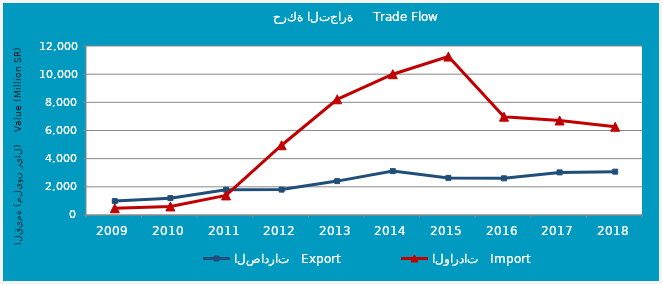
| Category | الصادرات   Export | الواردات   Import |
|---|---|---|
| 2009.0 | 987022297 | 477015029 |
| 2010.0 | 1197208048 | 607322872 |
| 2011.0 | 1796453789 | 1391921185 |
| 2012.0 | 1803195987 | 4952975328 |
| 2013.0 | 2406576421 | 8216343098 |
| 2014.0 | 3115123290 | 9997624106 |
| 2015.0 | 2635999903 | 11249555460 |
| 2016.0 | 2604767068 | 6981829012 |
| 2017.0 | 3025950574 | 6710351659 |
| 2018.0 | 3077444357 | 6264513685 |